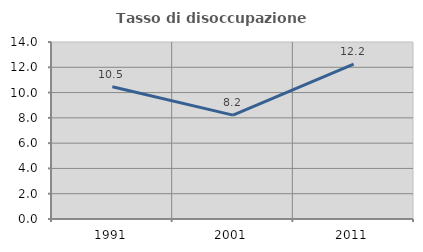
| Category | Tasso di disoccupazione giovanile  |
|---|---|
| 1991.0 | 10.465 |
| 2001.0 | 8.219 |
| 2011.0 | 12.245 |